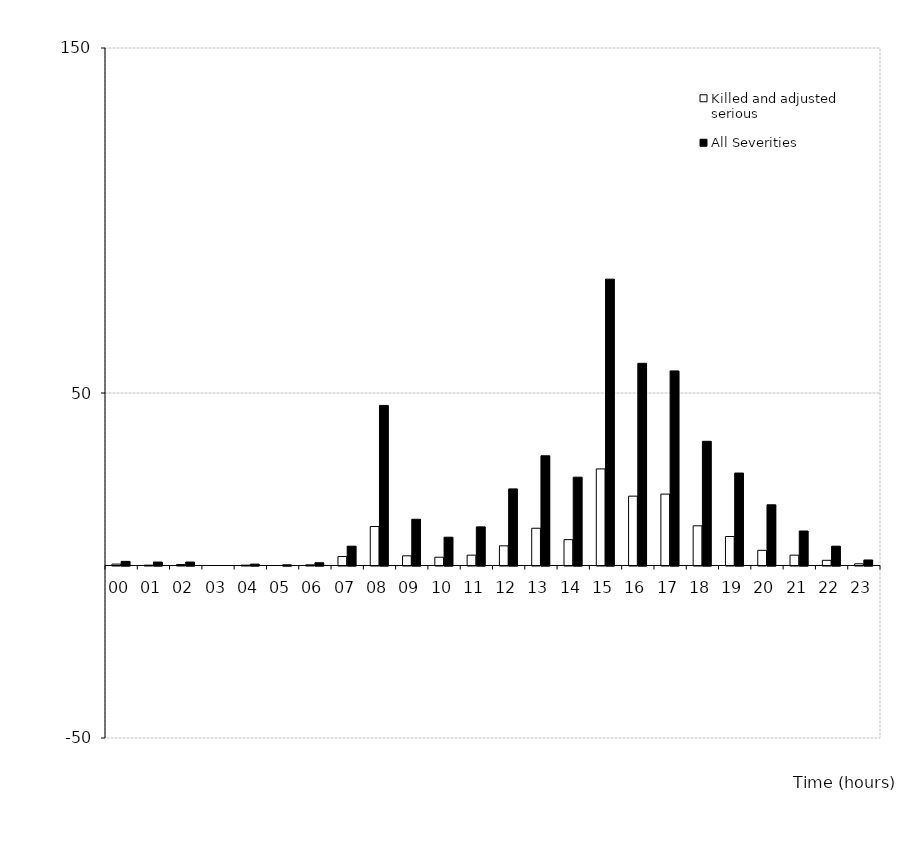
| Category | Killed and adjusted serious | All Severities |
|---|---|---|
| 00 | 0.4 | 1.2 |
| 01 | 0.1 | 1 |
| 02 | 0.3 | 1 |
| 03 | 0 | 0 |
| 04 | 0.1 | 0.4 |
| 05 | 0 | 0.2 |
| 06 | 0.2 | 0.8 |
| 07 | 2.6 | 5.6 |
| 08 | 11.3 | 46.4 |
| 09 | 2.8 | 13.4 |
| 10 | 2.4 | 8.2 |
| 11 | 3 | 11.2 |
| 12 | 5.7 | 22.2 |
| 13 | 10.8 | 31.8 |
| 14 | 7.5 | 25.6 |
| 15 | 28 | 83 |
| 16 | 20.1 | 58.6 |
| 17 | 20.7 | 56.4 |
| 18 | 11.5 | 36 |
| 19 | 8.4 | 26.8 |
| 20 | 4.4 | 17.6 |
| 21 | 3 | 10 |
| 22 | 1.5 | 5.6 |
| 23 | 0.5 | 1.6 |